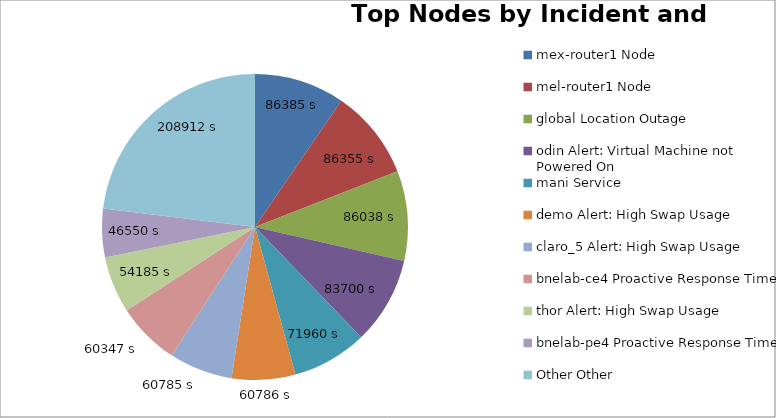
| Category | Series 0 |
|---|---|
| 0 | 86385 |
| 1 | 86355 |
| 2 | 86038 |
| 3 | 83700 |
| 4 | 71960 |
| 5 | 60786 |
| 6 | 60785 |
| 7 | 60347 |
| 8 | 54185 |
| 9 | 46550 |
| 10 | 208912 |